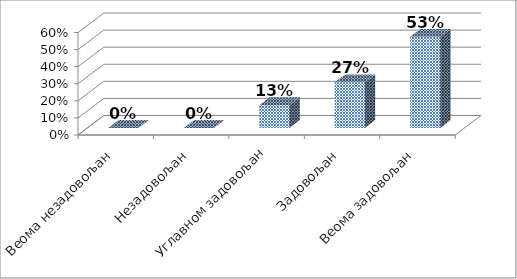
| Category | Series 0 |
|---|---|
| Веома незадовољан | 0 |
| Незадовољан | 0 |
| Углавном задовољан | 0.133 |
| Задовољан | 0.267 |
| Веома задовољан | 0.533 |